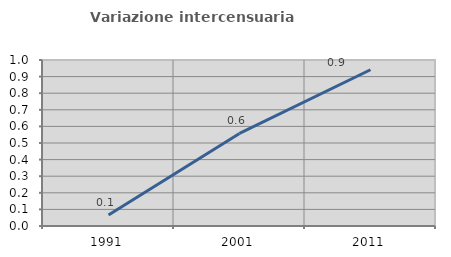
| Category | Variazione intercensuaria annua |
|---|---|
| 1991.0 | 0.066 |
| 2001.0 | 0.558 |
| 2011.0 | 0.941 |